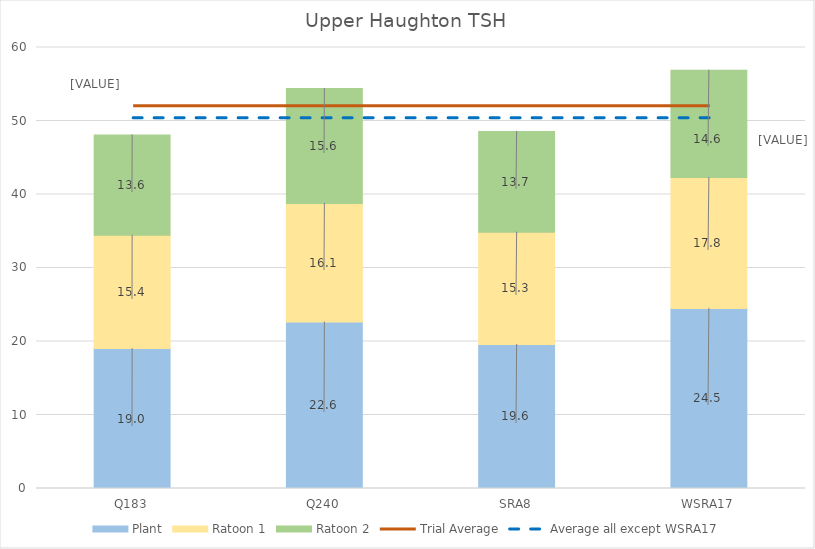
| Category | Plant | Ratoon 1 | Ratoon 2 |
|---|---|---|---|
| Q183 | 19.032 | 15.436 | 13.639 |
| Q240 | 22.648 | 16.138 | 15.634 |
| SRA8 | 19.603 | 15.273 | 13.708 |
| WSRA17 | 24.507 | 17.802 | 14.591 |